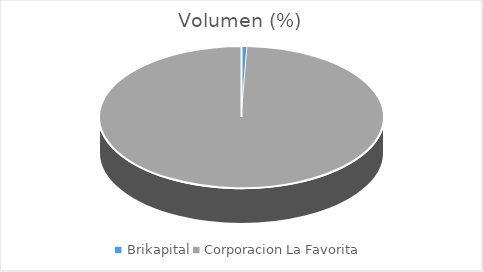
| Category | Series 0 |
|---|---|
| Brikapital | 11000 |
| Corporacion La Favorita | 1637268.39 |